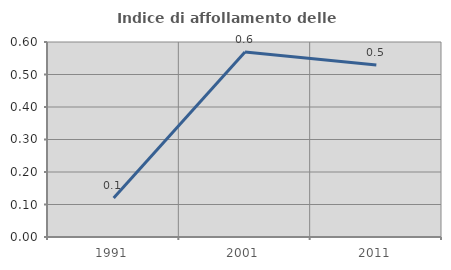
| Category | Indice di affollamento delle abitazioni  |
|---|---|
| 1991.0 | 0.12 |
| 2001.0 | 0.569 |
| 2011.0 | 0.529 |